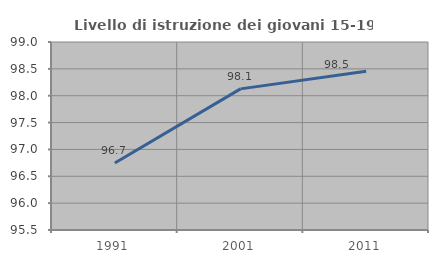
| Category | Livello di istruzione dei giovani 15-19 anni |
|---|---|
| 1991.0 | 96.748 |
| 2001.0 | 98.127 |
| 2011.0 | 98.456 |